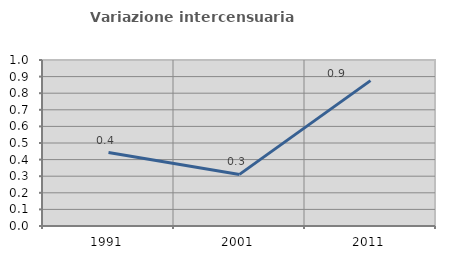
| Category | Variazione intercensuaria annua |
|---|---|
| 1991.0 | 0.443 |
| 2001.0 | 0.311 |
| 2011.0 | 0.876 |